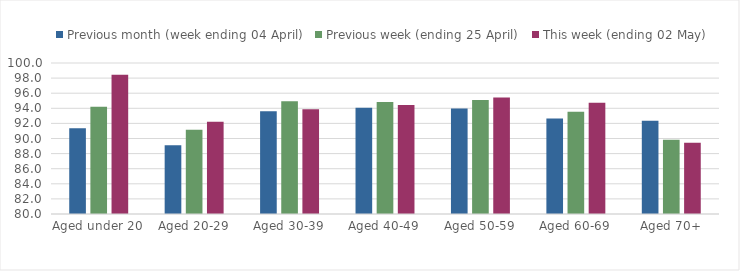
| Category | Previous month (week ending 04 April) | Previous week (ending 25 April) | This week (ending 02 May) |
|---|---|---|---|
| Aged under 20 | 91.356 | 94.206 | 98.43 |
| Aged 20-29 | 89.097 | 91.161 | 92.21 |
| Aged 30-39 | 93.614 | 94.939 | 93.867 |
| Aged 40-49 | 94.064 | 94.843 | 94.449 |
| Aged 50-59 | 93.961 | 95.104 | 95.439 |
| Aged 60-69 | 92.644 | 93.532 | 94.738 |
| Aged 70+ | 92.36 | 89.819 | 89.443 |